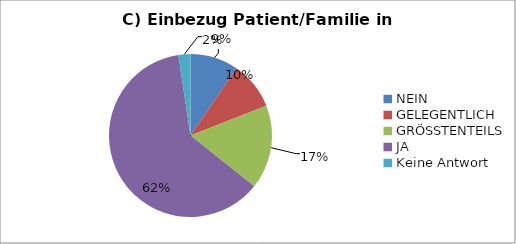
| Category | Series 0 |
|---|---|
| NEIN | 4 |
| GELEGENTLICH | 4 |
| GRÖSSTENTEILS | 7 |
| JA | 26 |
| Keine Antwort | 1 |